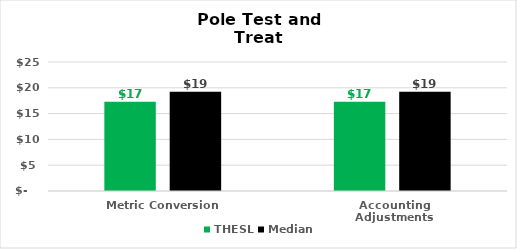
| Category | THESL | Median |
|---|---|---|
| Metric Conversion | 17.281 | 19.224 |
| Accounting Adjustments | 17.281 | 19.224 |